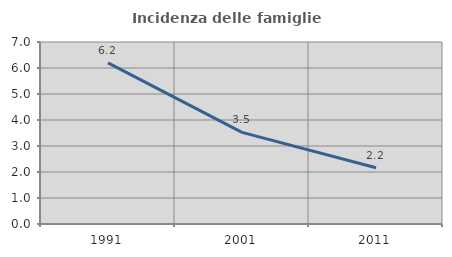
| Category | Incidenza delle famiglie numerose |
|---|---|
| 1991.0 | 6.199 |
| 2001.0 | 3.525 |
| 2011.0 | 2.163 |